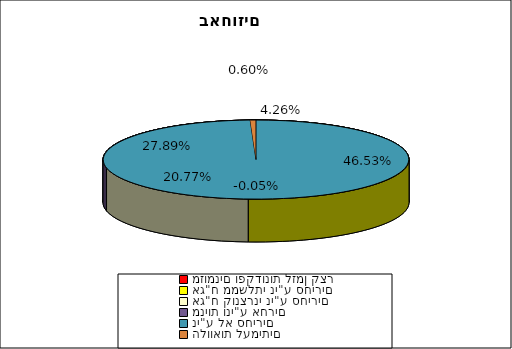
| Category | Series 0 |
|---|---|
| מזומנים ופקדונות לזמן קצר | 0.043 |
| אג"ח ממשלתי ני"ע סחירים | 0.465 |
| אג"ח קונצרני ני"ע סחירים | 0.208 |
| מניות וני"ע אחרים | 0.279 |
| ני"ע לא סחירים | -0.001 |
| הלוואות לעמיתים | 0.006 |